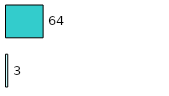
| Category | Series 0 | Series 1 |
|---|---|---|
| 0 | 3 | 64 |